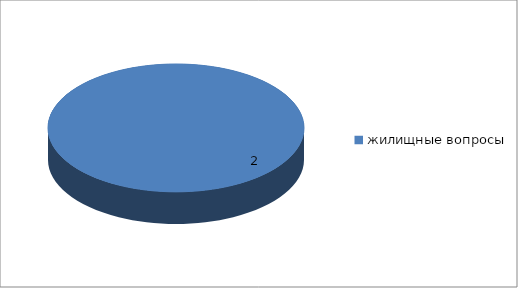
| Category | Series 0 |
|---|---|
| жилищные вопросы | 2 |